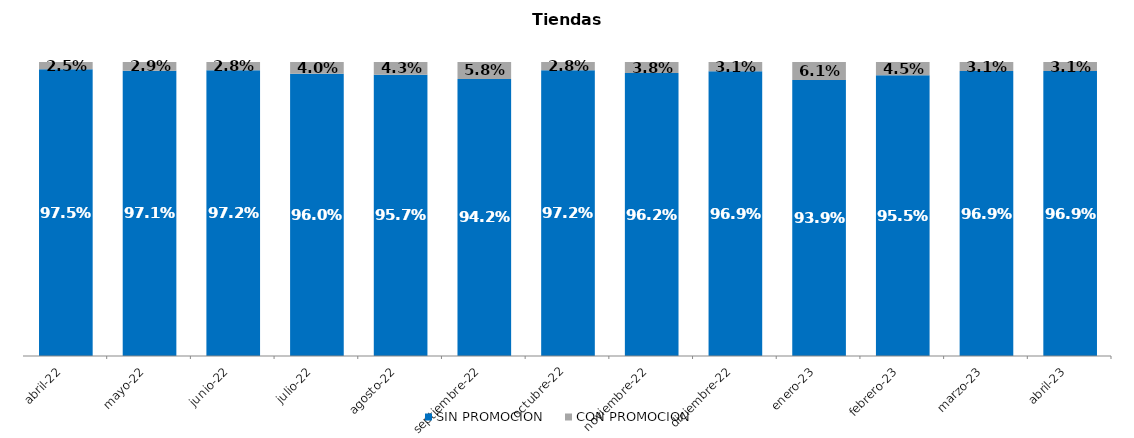
| Category | SIN PROMOCION   | CON PROMOCION   |
|---|---|---|
| 2022-04-01 | 0.975 | 0.025 |
| 2022-05-01 | 0.971 | 0.029 |
| 2022-06-01 | 0.972 | 0.028 |
| 2022-07-01 | 0.96 | 0.04 |
| 2022-08-01 | 0.957 | 0.043 |
| 2022-09-01 | 0.942 | 0.058 |
| 2022-10-01 | 0.972 | 0.028 |
| 2022-11-01 | 0.962 | 0.038 |
| 2022-12-01 | 0.969 | 0.031 |
| 2023-01-01 | 0.939 | 0.061 |
| 2023-02-01 | 0.955 | 0.045 |
| 2023-03-01 | 0.969 | 0.031 |
| 2023-04-01 | 0.969 | 0.031 |